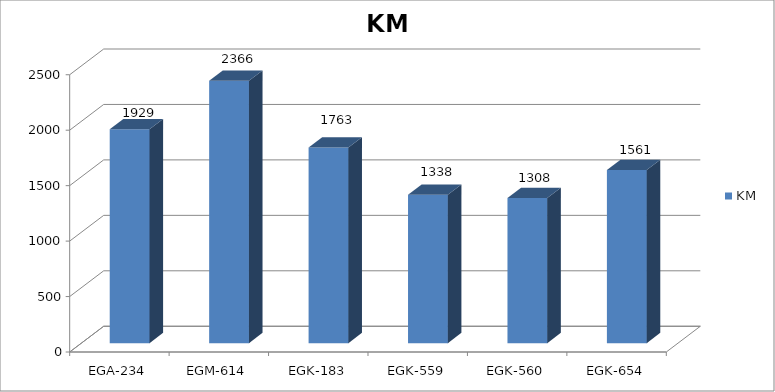
| Category | KM |
|---|---|
| EGA-234 | 1929 |
| EGM-614 | 2366 |
| EGK-183 | 1763 |
| EGK-559 | 1338 |
| EGK-560 | 1308 |
| EGK-654 | 1561 |